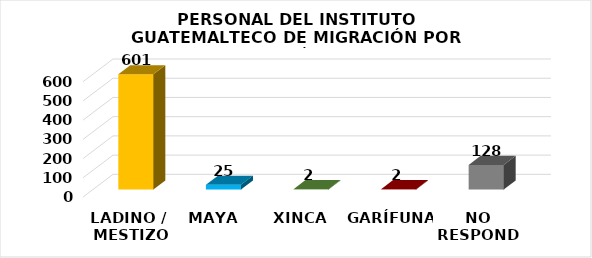
| Category | Series 0 |
|---|---|
| LADINO /
 MESTIZO | 601 |
| MAYA | 25 |
| XINCA | 2 |
| GARÍFUNA | 2 |
| NO RESPONDE | 128 |